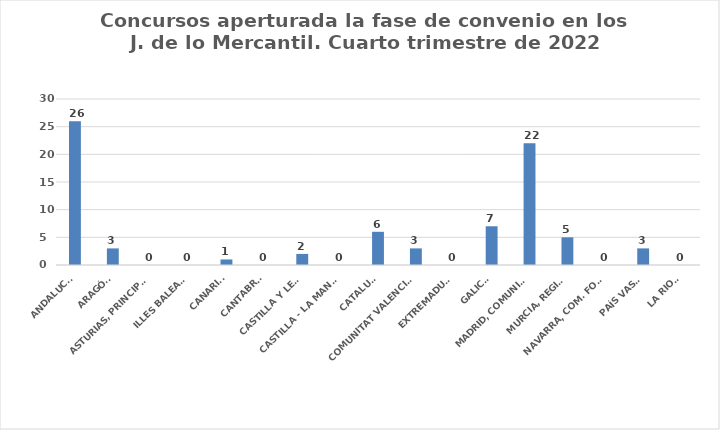
| Category | Series 0 |
|---|---|
| ANDALUCÍA | 26 |
| ARAGÓN | 3 |
| ASTURIAS, PRINCIPADO | 0 |
| ILLES BALEARS | 0 |
| CANARIAS | 1 |
| CANTABRIA | 0 |
| CASTILLA Y LEÓN | 2 |
| CASTILLA - LA MANCHA | 0 |
| CATALUÑA | 6 |
| COMUNITAT VALENCIANA | 3 |
| EXTREMADURA | 0 |
| GALICIA | 7 |
| MADRID, COMUNIDAD | 22 |
| MURCIA, REGIÓN | 5 |
| NAVARRA, COM. FORAL | 0 |
| PAÍS VASCO | 3 |
| LA RIOJA | 0 |